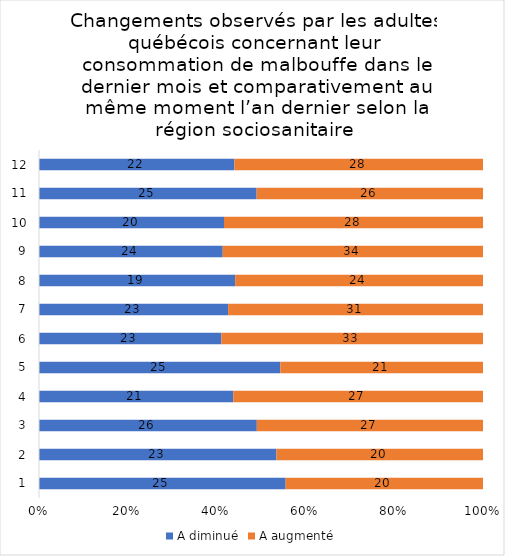
| Category | A diminué | A augmenté |
|---|---|---|
| 0 | 25 | 20 |
| 1 | 23 | 20 |
| 2 | 26 | 27 |
| 3 | 21 | 27 |
| 4 | 25 | 21 |
| 5 | 23 | 33 |
| 6 | 23 | 31 |
| 7 | 19 | 24 |
| 8 | 24 | 34 |
| 9 | 20 | 28 |
| 10 | 25 | 26 |
| 11 | 22 | 28 |